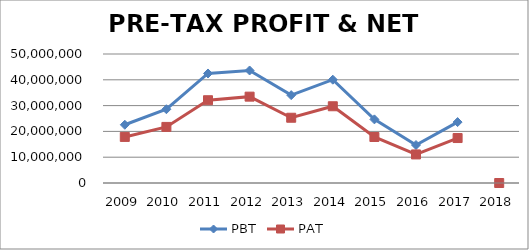
| Category | PBT | PAT |
|---|---|---|
| 2009.0 | 22576924 | 17854221 |
| 2010.0 | 28593663 | 21741325 |
| 2011.0 | 42449536 | 32083145 |
| 2012.0 | 43605431 | 33470740 |
| 2013.0 | 34056071 | 25293936 |
| 2014.0 | 40042605 | 29742425 |
| 2015.0 | 24663555 | 17833017 |
| 2016.0 | 14725879 | 11071841 |
| 2017.0 | 23606938 | 17425334 |
| 2018.0 | 0 | 0 |